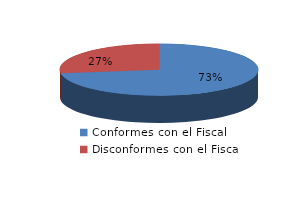
| Category | Series 0 |
|---|---|
| 0 | 600 |
| 1 | 225 |